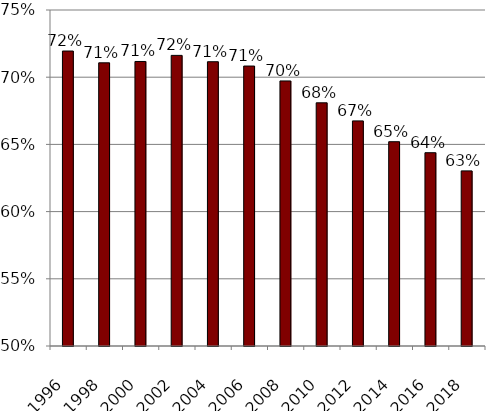
| Category | Has Will |
|---|---|
| 1996.0 | 0.719 |
| 1998.0 | 0.711 |
| 2000.0 | 0.712 |
| 2002.0 | 0.716 |
| 2004.0 | 0.712 |
| 2006.0 | 0.708 |
| 2008.0 | 0.697 |
| 2010.0 | 0.681 |
| 2012.0 | 0.667 |
| 2014.0 | 0.652 |
| 2016.0 | 0.644 |
| 2018.0 | 0.63 |